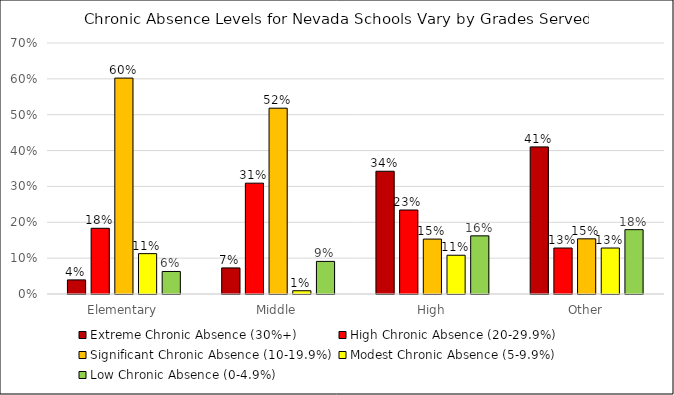
| Category | Extreme Chronic Absence (30%+) | High Chronic Absence (20-29.9%) | Significant Chronic Absence (10-19.9%) | Modest Chronic Absence (5-9.9%) | Low Chronic Absence (0-4.9%) |
|---|---|---|---|---|---|
| Elementary | 0.039 | 0.183 | 0.602 | 0.113 | 0.063 |
| Middle | 0.073 | 0.309 | 0.518 | 0.009 | 0.091 |
| High | 0.342 | 0.234 | 0.153 | 0.108 | 0.162 |
| Other | 0.41 | 0.128 | 0.154 | 0.128 | 0.179 |